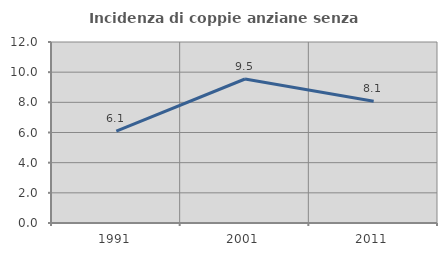
| Category | Incidenza di coppie anziane senza figli  |
|---|---|
| 1991.0 | 6.089 |
| 2001.0 | 9.548 |
| 2011.0 | 8.071 |